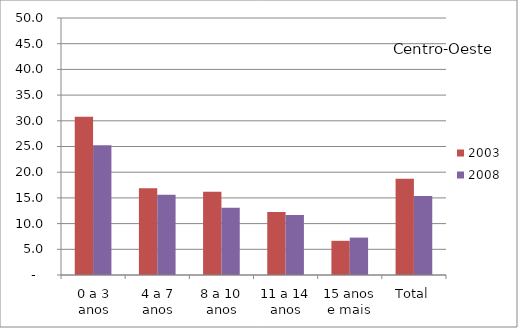
| Category | 2003 | 2008 |
|---|---|---|
| 0 a 3 anos | 30.8 | 25.26 |
| 4 a 7 anos | 16.88 | 15.62 |
| 8 a 10 anos | 16.21 | 13.06 |
| 11 a 14 anos | 12.26 | 11.68 |
| 15 anos e mais | 6.65 | 7.28 |
| Total | 18.73 | 15.37 |